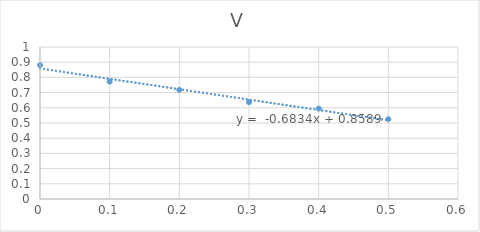
| Category | V |
|---|---|
| 0.5 | 0.525 |
| 0.4 | 0.595 |
| 0.3 | 0.637 |
| 0.2 | 0.718 |
| 0.1 | 0.772 |
| 0.0 | 0.881 |